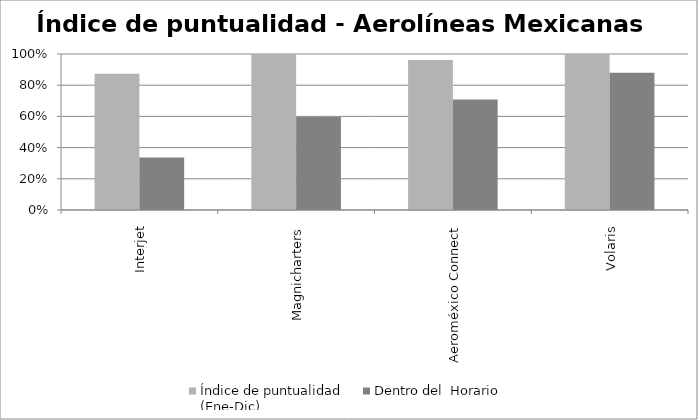
| Category | Índice de puntualidad
(Ene-Dic) | Dentro del  Horario |
|---|---|---|
| Interjet | 0.874 | 0.336 |
| Magnicharters | 1 | 0.597 |
| Aeroméxico Connect | 0.962 | 0.709 |
| Volaris | 1 | 0.879 |